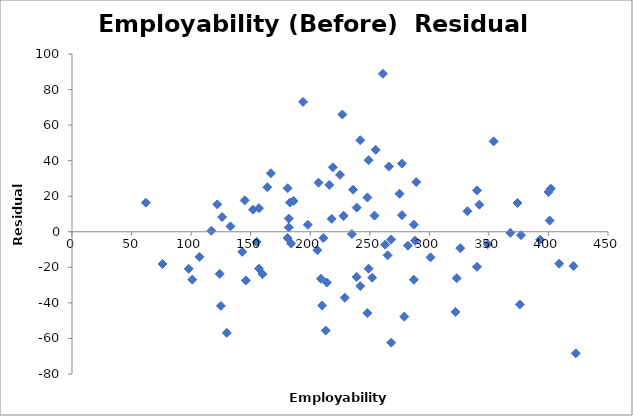
| Category | Series 0 |
|---|---|
| 252.0 | -25.836 |
| 423.0 | -68.404 |
| 101.0 | -26.919 |
| 288.0 | -5.008 |
| 248.0 | -45.706 |
| 145.0 | 17.648 |
| 401.0 | 6.312 |
| 287.0 | 4.024 |
| 275.0 | 21.415 |
| 254.0 | 9.099 |
| 182.0 | 2.443 |
| 117.0 | 0.56 |
| 130.0 | -56.863 |
| 219.0 | 36.239 |
| 152.0 | 12.42 |
| 228.0 | 8.946 |
| 62.0 | 16.351 |
| 393.0 | -4.427 |
| 277.0 | 38.35 |
| 206.0 | -10.338 |
| 229.0 | -37.087 |
| 182.0 | 7.443 |
| 98.0 | -20.821 |
| 125.0 | -41.7 |
| 164.0 | 25.03 |
| 186.0 | 17.313 |
| 235.0 | -1.282 |
| 184.0 | -6.622 |
| 76.0 | -18.105 |
| 126.0 | 8.267 |
| 183.0 | 16.411 |
| 242.0 | 51.49 |
| 207.0 | 27.629 |
| 181.0 | 24.476 |
| 239.0 | -25.413 |
| 216.0 | 26.336 |
| 289.0 | 27.959 |
| 213.0 | -55.566 |
| 209.0 | -26.436 |
| 376.0 | -40.874 |
| 332.0 | 11.559 |
| 249.0 | 40.262 |
| 228.0 | 8.946 |
| 124.0 | -23.668 |
| 194.0 | 73.053 |
| 157.0 | -20.742 |
| 402.0 | 24.28 |
| 323.0 | -26.148 |
| 181.0 | -3.524 |
| 157.0 | 13.258 |
| 266.0 | 36.708 |
| 268.0 | -4.357 |
| 167.0 | 32.932 |
| 342.0 | 15.233 |
| 349.0 | -6.995 |
| 340.0 | 23.299 |
| 227.0 | 65.978 |
| 409.0 | -17.948 |
| 400.0 | 22.345 |
| 374.0 | 16.191 |
| 255.0 | 46.066 |
| 146.0 | -27.384 |
| 248.0 | 19.294 |
| 198.0 | 3.922 |
| 210.0 | -41.468 |
| 107.0 | -14.114 |
| 239.0 | 13.587 |
| 287.0 | -26.976 |
| 340.0 | -19.701 |
| 155.0 | -5.677 |
| 263.0 | -7.194 |
| 265.0 | -13.259 |
| 249.0 | -20.738 |
| 377.0 | -1.906 |
| 301.0 | -14.432 |
| 242.0 | -30.51 |
| 211.0 | -3.501 |
| 160.0 | -23.84 |
| 218.0 | 7.271 |
| 133.0 | 3.039 |
| 122.0 | 15.397 |
| 236.0 | 23.685 |
| 143.0 | -11.287 |
| 354.0 | 50.843 |
| 214.0 | -28.599 |
| 225.0 | 32.043 |
| 261.0 | 88.871 |
| 277.0 | 9.35 |
| 282.0 | -7.813 |
| 322.0 | -45.115 |
| 326.0 | -9.246 |
| 421.0 | -19.339 |
| 368.0 | -0.613 |
| 279.0 | -47.715 |
| 268.0 | -62.357 |